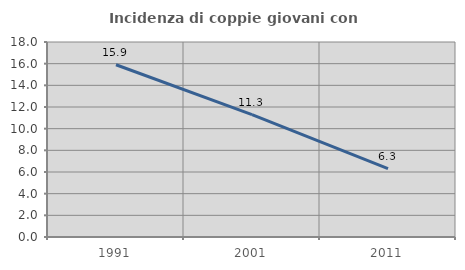
| Category | Incidenza di coppie giovani con figli |
|---|---|
| 1991.0 | 15.902 |
| 2001.0 | 11.293 |
| 2011.0 | 6.309 |